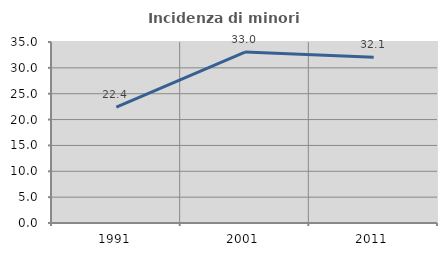
| Category | Incidenza di minori stranieri |
|---|---|
| 1991.0 | 22.388 |
| 2001.0 | 33.046 |
| 2011.0 | 32.063 |